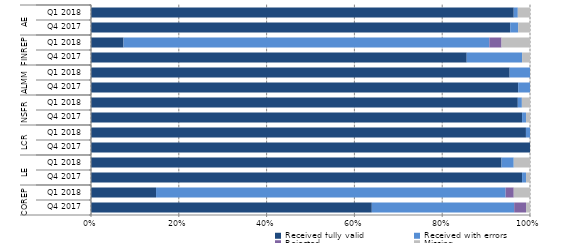
| Category | Received fully valid | Received with errors | Rejected | Missing |
|---|---|---|---|---|
| 0 | 71 | 36 | 3 | 1 |
| 1 | 16 | 86 | 2 | 4 |
| 2 | 109 | 1 | 0 | 1 |
| 3 | 101 | 3 | 0 | 4 |
| 4 | 111 | 0 | 0 | 0 |
| 5 | 107 | 1 | 0 | 0 |
| 6 | 109 | 1 | 0 | 1 |
| 7 | 105 | 1 | 0 | 2 |
| 8 | 108 | 3 | 0 | 0 |
| 9 | 103 | 5 | 0 | 0 |
| 10 | 95 | 14 | 0 | 2 |
| 11 | 8 | 90 | 3 | 7 |
| 12 | 106 | 2 | 0 | 3 |
| 13 | 104 | 1 | 0 | 3 |